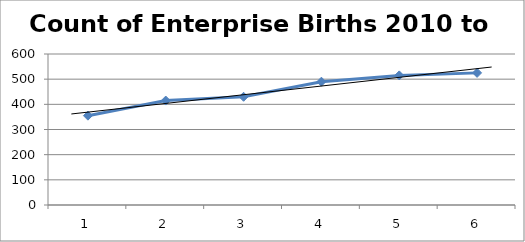
| Category | Series 0 |
|---|---|
| 0 | 355 |
| 1 | 415 |
| 2 | 430 |
| 3 | 490 |
| 4 | 515 |
| 5 | 525 |